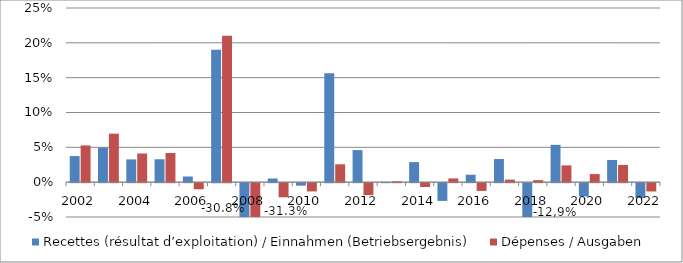
| Category | Recettes (résultat d’exploitation) / Einnahmen (Betriebsergebnis) | Dépenses / Ausgaben |
|---|---|---|
| 2002.0 | 0.037 | 0.053 |
| 2003.0 | 0.05 | 0.07 |
| 2004.0 | 0.033 | 0.041 |
| 2005.0 | 0.033 | 0.042 |
| 2006.0 | 0.008 | -0.009 |
| 2007.0 | 0.19 | 0.21 |
| 2008.0 | -0.308 | -0.313 |
| 2009.0 | 0.005 | -0.02 |
| 2010.0 | -0.004 | -0.012 |
| 2011.0 | 0.156 | 0.026 |
| 2012.0 | 0.046 | -0.017 |
| 2013.0 | 0 | 0.001 |
| 2014.0 | 0.029 | -0.006 |
| 2015.0 | -0.025 | 0.005 |
| 2016.0 | 0.011 | -0.011 |
| 2017.0 | 0.033 | 0.004 |
| 2018.0 | -0.129 | 0.003 |
| 2019.0 | 0.054 | 0.024 |
| 2020.0 | -0.019 | 0.012 |
| 2021.0 | 0.032 | 0.025 |
| 2022.0 | -0.021 | -0.012 |